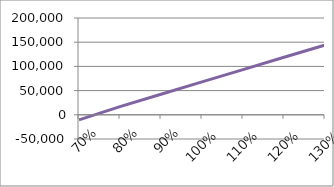
| Category | Series 3 |
|---|---|
| 0.7 | -10508.484 |
| 0.8 | 16918.314 |
| 0.9 | 42579.016 |
| 1.0 | 68097.938 |
| 1.1 | 93465.644 |
| 1.2 | 118807.139 |
| 1.3 | 144190.201 |